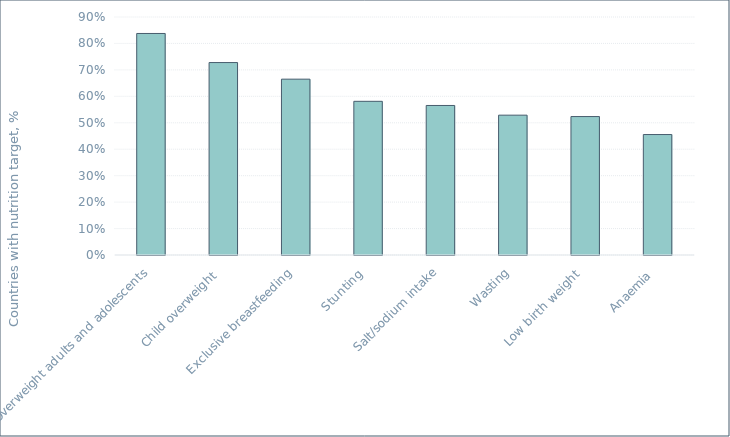
| Category | Series 0 |
|---|---|
| Overweight adults and adolescents | 0.838 |
| Child overweight  | 0.728 |
| Exclusive breastfeeding | 0.665 |
| Stunting  | 0.581 |
| Salt/sodium intake | 0.565 |
| Wasting | 0.529 |
| Low birth weight  | 0.524 |
| Anaemia  | 0.455 |